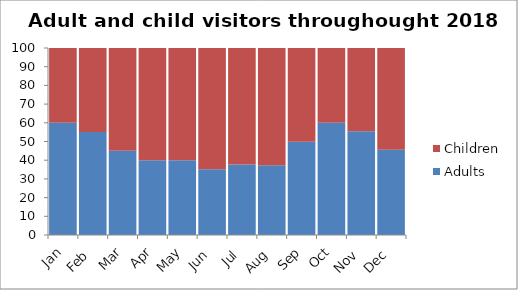
| Category | Adults | Children |
|---|---|---|
| Jan | 60 | 40 |
| Feb | 55.147 | 44.853 |
| Mar | 45.087 | 54.913 |
| Apr | 40 | 60 |
| May | 40 | 60 |
| Jun | 35.204 | 64.796 |
| Jul | 37.763 | 62.237 |
| Aug | 37.326 | 62.674 |
| Sep | 49.894 | 50.106 |
| Oct | 60 | 40 |
| Nov | 55.432 | 44.568 |
| Dec | 45.614 | 54.386 |